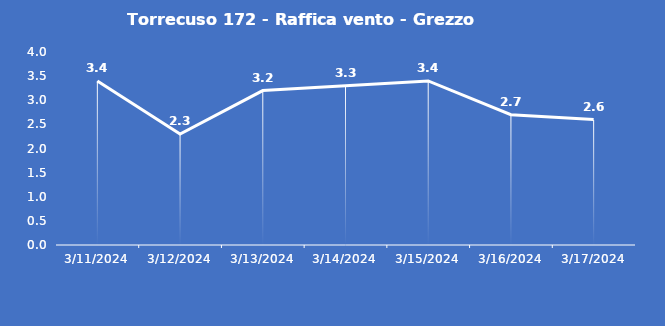
| Category | Torrecuso 172 - Raffica vento - Grezzo (m/s) |
|---|---|
| 3/11/24 | 3.4 |
| 3/12/24 | 2.3 |
| 3/13/24 | 3.2 |
| 3/14/24 | 3.3 |
| 3/15/24 | 3.4 |
| 3/16/24 | 2.7 |
| 3/17/24 | 2.6 |